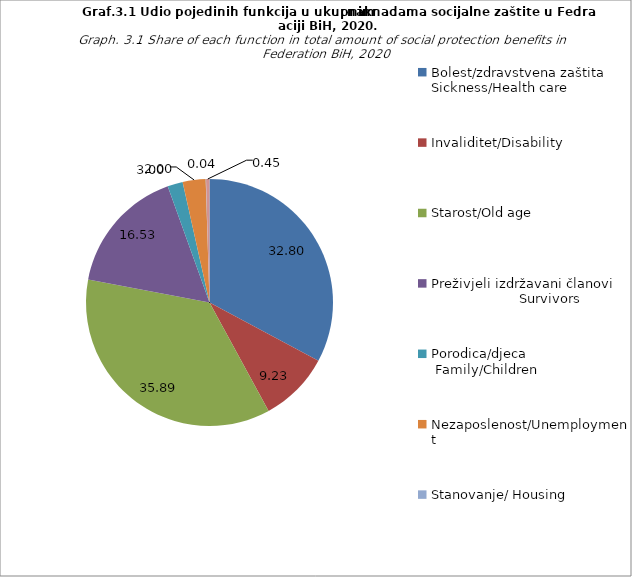
| Category | Series 0 |
|---|---|
| Bolest/zdravstvena zaštita  Sickness/Health care | 32.804 |
| Invaliditet/Disability | 9.226 |
| Starost/Old age | 35.89 |
| Preživjeli izdržavani članovi                           Survivors | 16.533 |
| Porodica/djeca                           Family/Children | 1.996 |
| Nezaposlenost/Unemployment | 3.001 |
| Stanovanje/ Housing | 0.041 |
| Socijalna isključenost koja nije drugdje kvalifikovana                                   Social exclusion not elsewhere  classified | 0.45 |